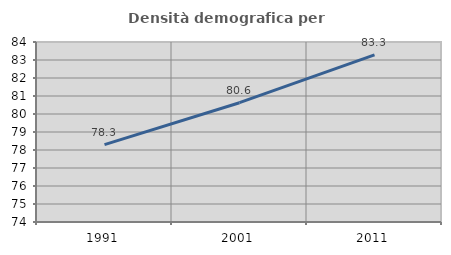
| Category | Densità demografica |
|---|---|
| 1991.0 | 78.3 |
| 2001.0 | 80.628 |
| 2011.0 | 83.282 |